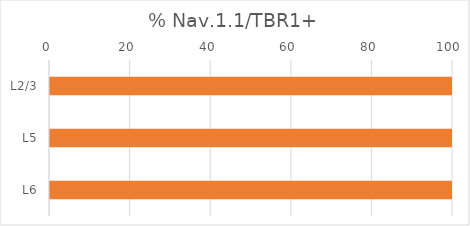
| Category | Series 0 | Series 1 |
|---|---|---|
| L2/3 | 0 | 100 |
| L5 | 0 | 100 |
| L6 | 0 | 100 |